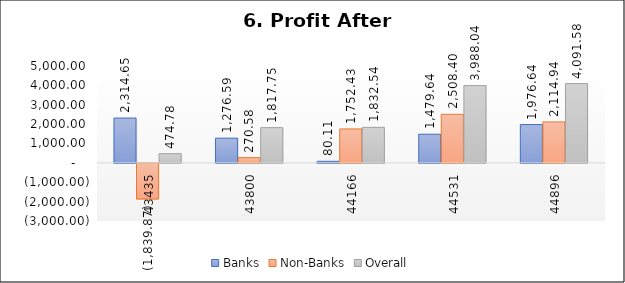
| Category |  Banks  |  Non-Banks  |  Overall  |
|---|---|---|---|
| 2018-12-01 | 2314.648 | -1839.873 | 474.78 |
| 2019-12-01 | 1276.592 | 270.579 | 1817.749 |
| 2020-12-01 | 80.106 | 1752.433 | 1832.539 |
| 2021-12-01 | 1479.639 | 2508.404 | 3988.043 |
| 2022-12-01 | 1976.641 | 2114.935 | 4091.576 |